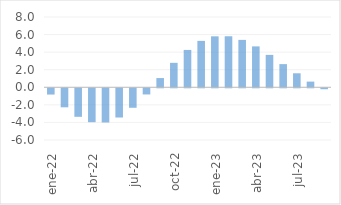
| Category | Total |
|---|---|
| ene-22 | -0.713 |
| feb-22 | -2.165 |
| mar-22 | -3.247 |
| abr-22 | -3.859 |
| may-22 | -3.893 |
| jun-22 | -3.327 |
| jul-22 | -2.219 |
| ago-22 | -0.702 |
| sep-22 | 1.05 |
| oct-22 | 2.783 |
| nov-22 | 4.252 |
| dic-22 | 5.283 |
| ene-23 | 5.8 |
| feb-23 | 5.808 |
| mar-23 | 5.394 |
| abr-23 | 4.656 |
| may-23 | 3.689 |
| jun-23 | 2.637 |
| jul-23 | 1.594 |
| ago-23 | 0.647 |
| sep-23 | -0.108 |